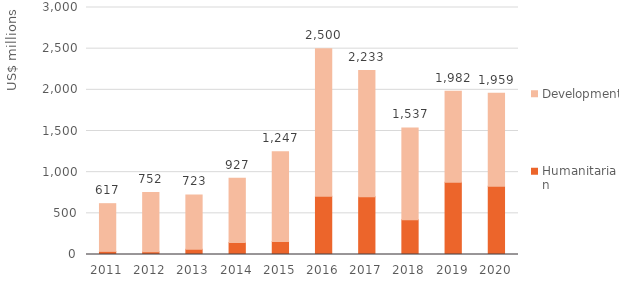
| Category | Humanitarian | Development |
|---|---|---|
| 2011.0 | 37.943 | 579.338 |
| 2012.0 | 32.924 | 719.573 |
| 2013.0 | 63.54 | 659.779 |
| 2014.0 | 146.217 | 780.369 |
| 2015.0 | 159.005 | 1087.774 |
| 2016.0 | 707.896 | 1792.276 |
| 2017.0 | 700.489 | 1532.908 |
| 2018.0 | 423.393 | 1113.829 |
| 2019.0 | 877.374 | 1104.372 |
| 2020.0 | 830.247 | 1128.265 |